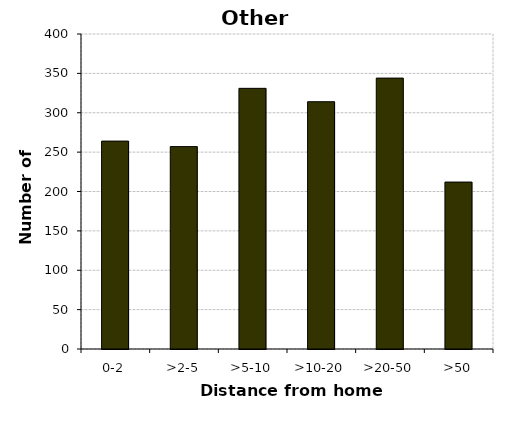
| Category | Other vehicles |
|---|---|
| 0-2 | 264 |
| >2-5 | 257 |
| >5-10 | 331 |
| >10-20 | 314 |
| >20-50 | 344 |
| >50 | 212 |